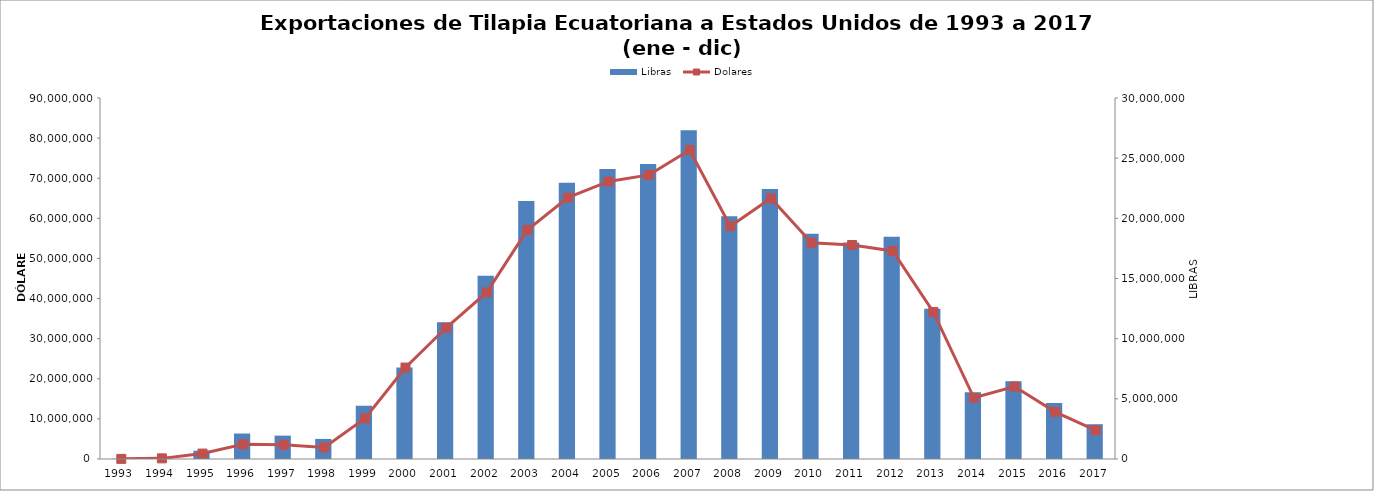
| Category | Libras |
|---|---|
| 1993.0 | 21730.742 |
| 1994.0 | 88499.258 |
| 1995.0 | 689457.786 |
| 1996.0 | 2116647.483 |
| 1997.0 | 1941708.064 |
| 1998.0 | 1668547.101 |
| 1999.0 | 4434656.516 |
| 2000.0 | 7599686.097 |
| 2001.0 | 11373890.75 |
| 2002.0 | 15219326.029 |
| 2003.0 | 21443302.043 |
| 2004.0 | 22953708.776 |
| 2005.0 | 24101028.913 |
| 2006.0 | 24512713.712 |
| 2007.0 | 27315395.237 |
| 2008.0 | 20170218.295 |
| 2009.0 | 22438586.35 |
| 2010.0 | 18724421.773 |
| 2011.0 | 17995543.535 |
| 2012.0 | 18477544.051 |
| 2013.0 | 12494087.693 |
| 2014.0 | 5552509.969 |
| 2015.0 | 6465454.516 |
| 2016.0 | 4663040.341 |
| 2017.0 | 2890376.104 |